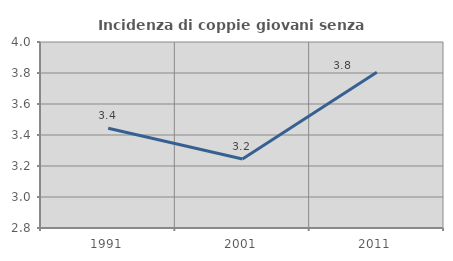
| Category | Incidenza di coppie giovani senza figli |
|---|---|
| 1991.0 | 3.444 |
| 2001.0 | 3.245 |
| 2011.0 | 3.805 |